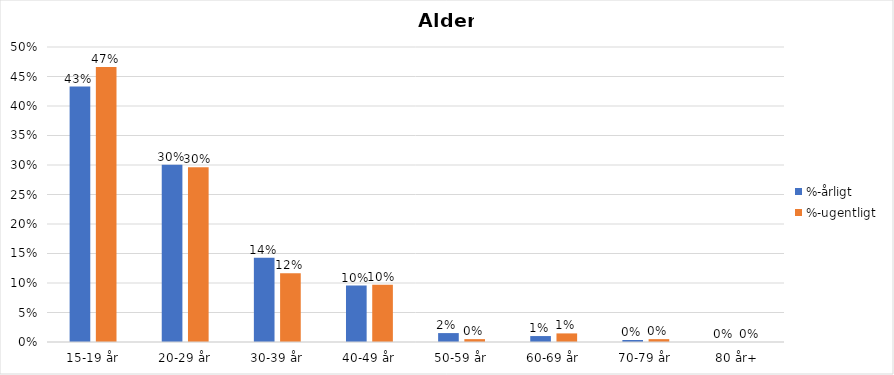
| Category | %-årligt | %-ugentligt |
|---|---|---|
| 15-19 år | 0.433 | 0.466 |
| 20-29 år | 0.3 | 0.296 |
| 30-39 år | 0.143 | 0.117 |
| 40-49 år | 0.096 | 0.097 |
| 50-59 år | 0.015 | 0.005 |
| 60-69 år | 0.01 | 0.015 |
| 70-79 år | 0.003 | 0.005 |
| 80 år+ | 0 | 0 |